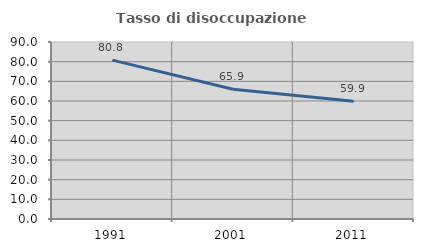
| Category | Tasso di disoccupazione giovanile  |
|---|---|
| 1991.0 | 80.803 |
| 2001.0 | 65.942 |
| 2011.0 | 59.864 |